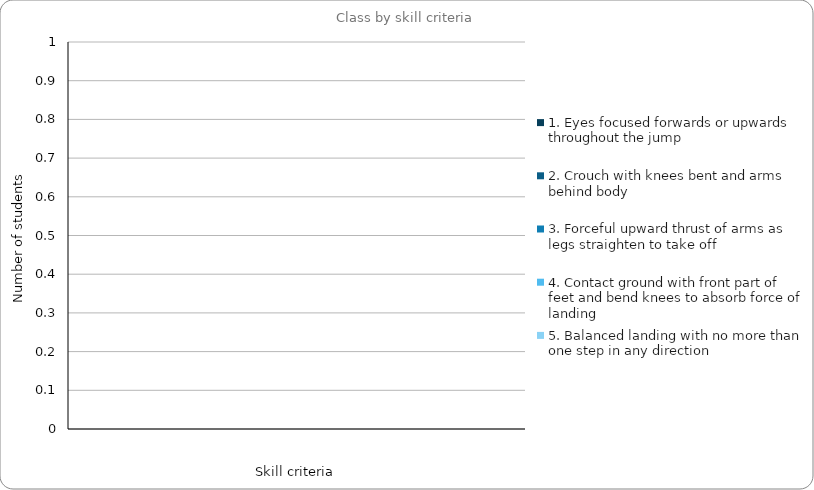
| Category | 1. Eyes focused forwards or upwards throughout the jump | 2. Crouch with knees bent and arms behind body | 3. Forceful upward thrust of arms as legs straighten to take off | 4. Contact ground with front part of feet and bend knees to absorb force of landing | 5. Balanced landing with no more than one step in any direction |
|---|---|---|---|---|---|
| 0 | 0 | 0 | 0 | 0 | 0 |